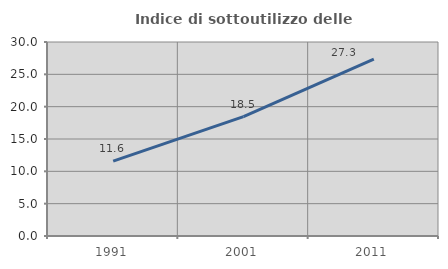
| Category | Indice di sottoutilizzo delle abitazioni  |
|---|---|
| 1991.0 | 11.583 |
| 2001.0 | 18.466 |
| 2011.0 | 27.343 |